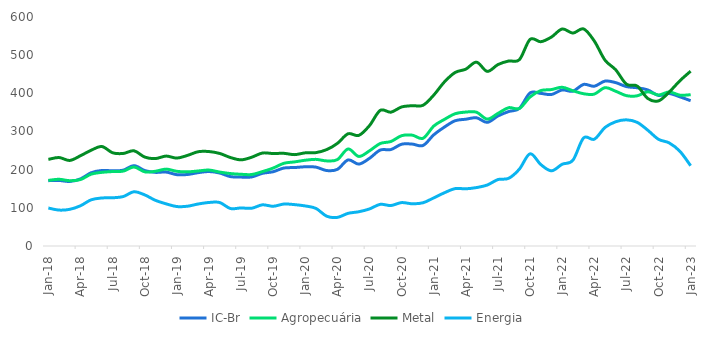
| Category | IC-Br | Agropecuária | Metal | Energia |
|---|---|---|---|---|
| 2018-01-01 | 171.2 | 171.89 | 226.95 | 99.46 |
| 2018-02-01 | 171.78 | 174.84 | 231.79 | 94.14 |
| 2018-03-01 | 169.09 | 171.09 | 224.14 | 96.08 |
| 2018-04-01 | 175.83 | 174.02 | 236.5 | 105.4 |
| 2018-05-01 | 191.92 | 188.25 | 250.89 | 121.01 |
| 2018-06-01 | 197.93 | 192.98 | 260.76 | 125.79 |
| 2018-07-01 | 197.04 | 195.08 | 244.25 | 126.38 |
| 2018-08-01 | 198.68 | 196.26 | 242.48 | 129.56 |
| 2018-09-01 | 210.59 | 206.97 | 249.44 | 142.21 |
| 2018-10-01 | 197.73 | 194.34 | 232.99 | 133.95 |
| 2018-11-01 | 192.92 | 195.76 | 229.03 | 119.66 |
| 2018-12-01 | 193.73 | 201.44 | 235.59 | 110.42 |
| 2019-01-01 | 186.91 | 195.69 | 230.31 | 103.37 |
| 2019-02-01 | 187.38 | 194.25 | 237.39 | 104.24 |
| 2019-03-01 | 192.19 | 196.56 | 247.03 | 110.08 |
| 2019-04-01 | 195.13 | 198.98 | 247.49 | 114 |
| 2019-05-01 | 191.27 | 193.74 | 242.52 | 113.97 |
| 2019-06-01 | 181.86 | 189.84 | 231.93 | 98.31 |
| 2019-07-01 | 180.49 | 187.91 | 225.68 | 99.68 |
| 2019-08-01 | 180.99 | 187.31 | 232.67 | 98.98 |
| 2019-09-01 | 190.45 | 194.95 | 243.61 | 107.86 |
| 2019-10-01 | 194.65 | 204.22 | 242.26 | 104.1 |
| 2019-11-01 | 204.27 | 216.67 | 242.82 | 109.9 |
| 2019-12-01 | 205.54 | 220.39 | 239.4 | 108.41 |
| 2020-01-01 | 207.56 | 224.73 | 244.1 | 104.95 |
| 2020-02-01 | 206.62 | 226.97 | 244.69 | 98.43 |
| 2020-03-01 | 197.72 | 222.98 | 252.59 | 78.1 |
| 2020-04-01 | 200.81 | 226.36 | 268.85 | 74.99 |
| 2020-05-01 | 225.52 | 254.25 | 294 | 85.56 |
| 2020-06-01 | 214.57 | 234.64 | 289.79 | 89.74 |
| 2020-07-01 | 229.77 | 249.4 | 315.48 | 97.08 |
| 2020-08-01 | 251.34 | 268.54 | 355.27 | 109.12 |
| 2020-09-01 | 252.69 | 273.79 | 350.69 | 106.04 |
| 2020-10-01 | 266.69 | 289.01 | 364.31 | 113.71 |
| 2020-11-01 | 267 | 290.4 | 367.6 | 110.59 |
| 2020-12-01 | 263.38 | 282.23 | 368.73 | 113.29 |
| 2021-01-01 | 291.18 | 314.23 | 395.29 | 126.03 |
| 2021-02-01 | 311.65 | 331.74 | 429.96 | 139.53 |
| 2021-03-01 | 328.22 | 346.53 | 454.64 | 150.32 |
| 2021-04-01 | 332.2 | 350.9 | 463.45 | 149.86 |
| 2021-05-01 | 335.87 | 350.52 | 481.68 | 153.11 |
| 2021-06-01 | 323.94 | 332.49 | 457.52 | 159.75 |
| 2021-07-01 | 340.69 | 347.42 | 475.38 | 174.06 |
| 2021-08-01 | 352.27 | 362.39 | 484.7 | 177.39 |
| 2021-09-01 | 360.47 | 360.43 | 488.15 | 201.36 |
| 2021-10-01 | 401.15 | 390.44 | 541.31 | 241.6 |
| 2021-11-01 | 399.81 | 407.22 | 535.25 | 213.48 |
| 2021-12-01 | 396.96 | 409.88 | 547.55 | 197 |
| 2022-01-01 | 408.84 | 415.9 | 568.62 | 214.19 |
| 2022-02-01 | 405.63 | 406.76 | 557.85 | 224.69 |
| 2022-03-01 | 423.39 | 398.94 | 568.76 | 283.14 |
| 2022-04-01 | 418.63 | 398 | 537.02 | 279.79 |
| 2022-05-01 | 432.11 | 414.86 | 486.93 | 310.53 |
| 2022-06-01 | 428.02 | 405.45 | 461.63 | 325.59 |
| 2022-07-01 | 417.62 | 393.98 | 423.98 | 330.55 |
| 2022-08-01 | 414.63 | 393.51 | 419.15 | 324.07 |
| 2022-09-01 | 408.91 | 404.05 | 386.43 | 303.29 |
| 2022-10-01 | 394.52 | 395.65 | 380.21 | 279.49 |
| 2022-11-01 | 399.49 | 403.66 | 403.49 | 270.1 |
| 2022-12-01 | 390.76 | 395.23 | 433.08 | 248.03 |
| 2023-01-01 | 380.67 | 396.44 | 458.02 | 210.31 |